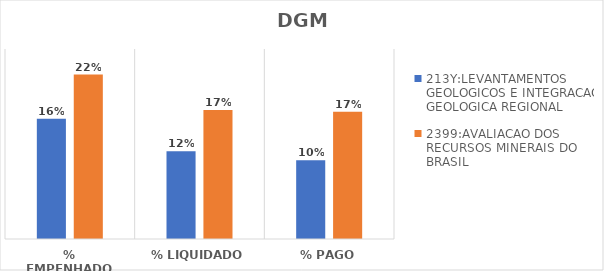
| Category | 213Y:LEVANTAMENTOS GEOLOGICOS E INTEGRACAO GEOLOGICA REGIONAL | 2399:AVALIACAO DOS RECURSOS MINERAIS DO BRASIL |
|---|---|---|
| % EMPENHADO | 0.158 | 0.216 |
| % LIQUIDADO | 0.115 | 0.17 |
| % PAGO | 0.104 | 0.168 |